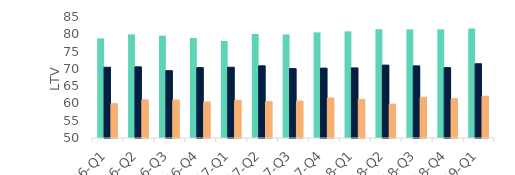
| Category | First-time
buyers | Homemovers | Homowner remortgaging |
|---|---|---|---|
| 16-Q1 | 78.813 | 70.469 | 59.92 |
| 16-Q2 | 79.984 | 70.578 | 61.037 |
| 16-Q3 | 79.596 | 69.474 | 60.978 |
| 16-Q4 | 78.925 | 70.355 | 60.426 |
| 17-Q1 | 78.059 | 70.466 | 60.913 |
| 17-Q2 | 80.09 | 70.879 | 60.514 |
| 17-Q3 | 79.956 | 70.078 | 60.689 |
| 17-Q4 | 80.549 | 70.216 | 61.564 |
| 18-Q1 | 80.849 | 70.276 | 61.141 |
| 18-Q2 | 81.464 | 71.084 | 59.791 |
| 18-Q3 | 81.407 | 70.855 | 61.796 |
| 18-Q4 | 81.428 | 70.349 | 61.349 |
| 19-Q1 | 81.665 | 71.473 | 62.083 |